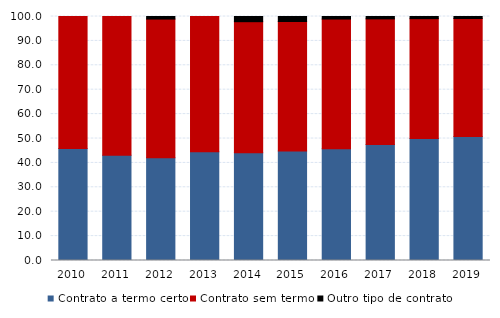
| Category | Contrato a termo certo | Contrato sem termo | Outro tipo de contrato |
|---|---|---|---|
| 2010.0 | 45.882 | 54.118 | 0 |
| 2011.0 | 43.182 | 56.818 | 0 |
| 2012.0 | 42.105 | 56.842 | 1.053 |
| 2013.0 | 44.565 | 55.435 | 0 |
| 2014.0 | 44.149 | 53.723 | 2.128 |
| 2015.0 | 44.898 | 53.061 | 2.041 |
| 2016.0 | 45.833 | 53.125 | 1.042 |
| 2017.0 | 47.573 | 51.456 | 0.971 |
| 2018.0 | 50 | 49.123 | 0.877 |
| 2019.0 | 50.82 | 48.361 | 0.82 |